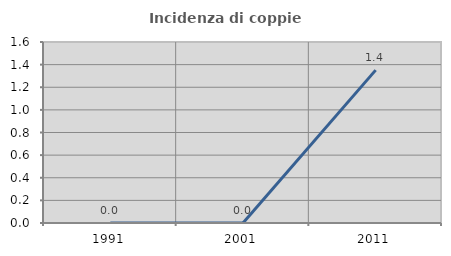
| Category | Incidenza di coppie miste |
|---|---|
| 1991.0 | 0 |
| 2001.0 | 0 |
| 2011.0 | 1.351 |